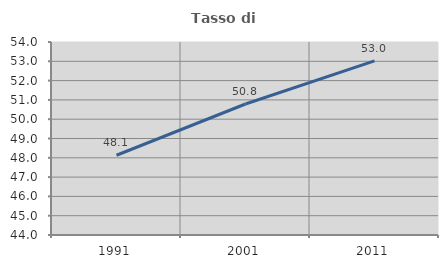
| Category | Tasso di occupazione   |
|---|---|
| 1991.0 | 48.132 |
| 2001.0 | 50.788 |
| 2011.0 | 53.019 |